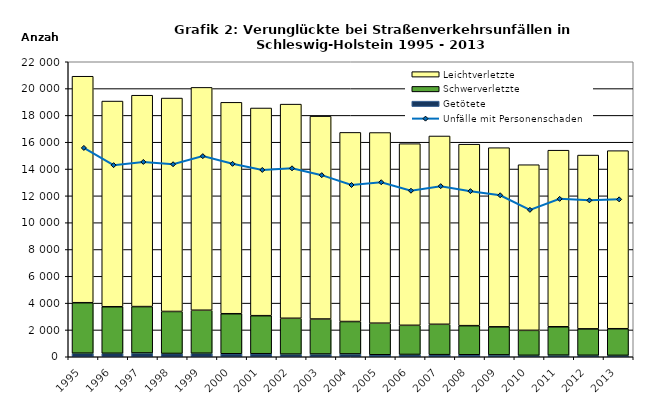
| Category | Getötete | Schwerverletzte | Leichtverletzte |
|---|---|---|---|
| 1995.0 | 268 | 3762 | 16890 |
| 1996.0 | 260 | 3469 | 15340 |
| 1997.0 | 282 | 3459 | 15764 |
| 1998.0 | 245 | 3132 | 15915 |
| 1999.0 | 264 | 3205 | 16619 |
| 2000.0 | 223 | 2985 | 15767 |
| 2001.0 | 226 | 2837 | 15488 |
| 2002.0 | 199 | 2670 | 15971 |
| 2003.0 | 204 | 2611 | 15128 |
| 2004.0 | 212 | 2415 | 14104 |
| 2005.0 | 148 | 2355 | 14219 |
| 2006.0 | 172 | 2173 | 13546 |
| 2007.0 | 156 | 2265 | 14043 |
| 2008.0 | 149 | 2169 | 13535 |
| 2009.0 | 140 | 2092 | 13360 |
| 2010.0 | 108 | 1862 | 12352 |
| 2011.0 | 120 | 2116 | 13169 |
| 2012.0 | 110 | 1970 | 12961 |
| 2013.0 | 103 | 1987 | 13280 |